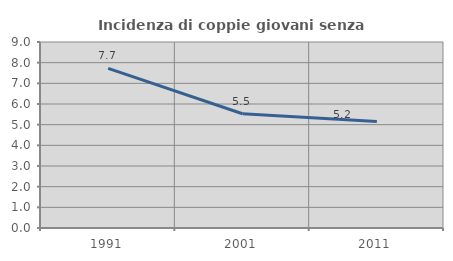
| Category | Incidenza di coppie giovani senza figli |
|---|---|
| 1991.0 | 7.721 |
| 2001.0 | 5.529 |
| 2011.0 | 5.158 |